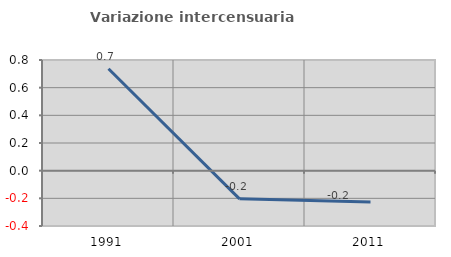
| Category | Variazione intercensuaria annua |
|---|---|
| 1991.0 | 0.737 |
| 2001.0 | -0.203 |
| 2011.0 | -0.227 |